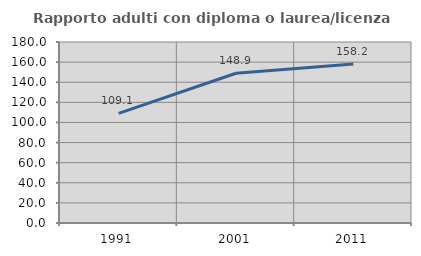
| Category | Rapporto adulti con diploma o laurea/licenza media  |
|---|---|
| 1991.0 | 109.091 |
| 2001.0 | 148.936 |
| 2011.0 | 158.182 |